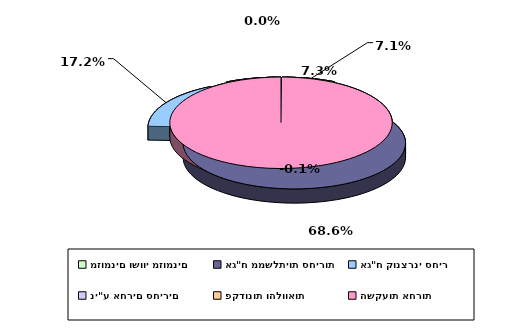
| Category | Series 0 |
|---|---|
| מזומנים ושווי מזומנים | 0.071 |
| אג"ח ממשלתיות סחירות | 0.686 |
| אג"ח קונצרני סחיר | 0.172 |
| ני"ע אחרים סחירים | 0.073 |
| פקדונות והלוואות | 0 |
| השקעות אחרות | -0.001 |